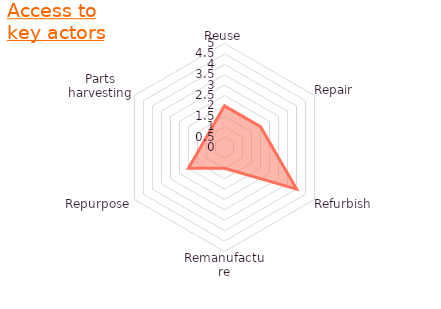
| Category | Fit with your access to key actors in value chain |
|---|---|
| Reuse | 2 |
| Repair | 2 |
| Refurbish | 4 |
| Remanufacture | 1 |
| Repurpose | 2 |
| Parts harvesting | 1 |